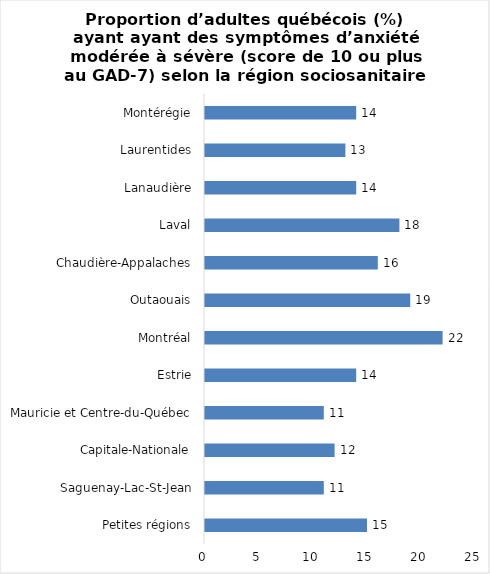
| Category | Series 0 |
|---|---|
| Petites régions | 15 |
| Saguenay-Lac-St-Jean | 11 |
| Capitale-Nationale | 12 |
| Mauricie et Centre-du-Québec | 11 |
| Estrie | 14 |
| Montréal | 22 |
| Outaouais | 19 |
| Chaudière-Appalaches | 16 |
| Laval | 18 |
| Lanaudière | 14 |
| Laurentides | 13 |
| Montérégie | 14 |